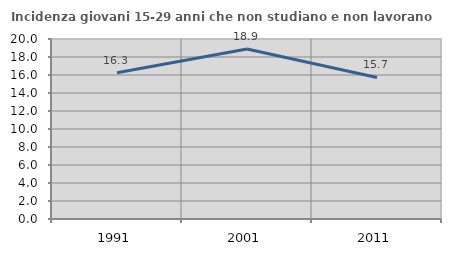
| Category | Incidenza giovani 15-29 anni che non studiano e non lavorano  |
|---|---|
| 1991.0 | 16.26 |
| 2001.0 | 18.898 |
| 2011.0 | 15.723 |